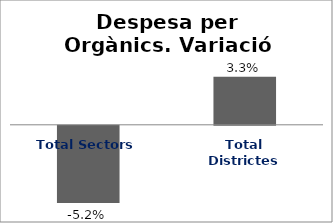
| Category | Series 0 |
|---|---|
| Total Sectors | -0.052 |
| Total Districtes | 0.033 |